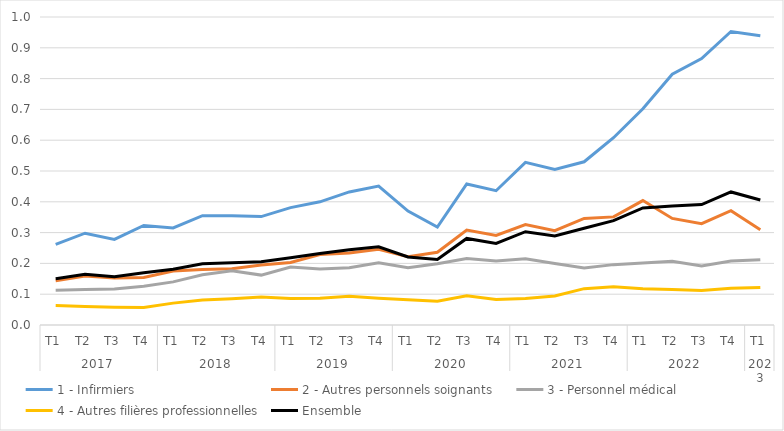
| Category | 1 - Infirmiers | 2 - Autres personnels soignants | 3 - Personnel médical | 4 - Autres filières professionnelles | Ensemble |
|---|---|---|---|---|---|
| 0 | 0.262 | 0.144 | 0.113 | 0.063 | 0.15 |
| 1 | 0.298 | 0.159 | 0.115 | 0.06 | 0.165 |
| 2 | 0.278 | 0.153 | 0.117 | 0.058 | 0.157 |
| 3 | 0.323 | 0.154 | 0.126 | 0.057 | 0.17 |
| 4 | 0.315 | 0.175 | 0.14 | 0.071 | 0.181 |
| 5 | 0.355 | 0.18 | 0.163 | 0.081 | 0.199 |
| 6 | 0.355 | 0.183 | 0.176 | 0.085 | 0.202 |
| 7 | 0.352 | 0.195 | 0.162 | 0.091 | 0.205 |
| 8 | 0.381 | 0.203 | 0.188 | 0.086 | 0.218 |
| 9 | 0.4 | 0.229 | 0.182 | 0.087 | 0.232 |
| 10 | 0.432 | 0.234 | 0.186 | 0.093 | 0.244 |
| 11 | 0.451 | 0.246 | 0.202 | 0.087 | 0.254 |
| 12 | 0.37 | 0.222 | 0.186 | 0.082 | 0.221 |
| 13 | 0.318 | 0.236 | 0.199 | 0.077 | 0.213 |
| 14 | 0.458 | 0.308 | 0.216 | 0.095 | 0.281 |
| 15 | 0.436 | 0.291 | 0.208 | 0.083 | 0.265 |
| 16 | 0.528 | 0.326 | 0.215 | 0.086 | 0.303 |
| 17 | 0.505 | 0.306 | 0.2 | 0.094 | 0.289 |
| 18 | 0.53 | 0.346 | 0.185 | 0.118 | 0.314 |
| 19 | 0.608 | 0.351 | 0.196 | 0.124 | 0.339 |
| 20 | 0.702 | 0.404 | 0.201 | 0.118 | 0.38 |
| 21 | 0.814 | 0.346 | 0.207 | 0.115 | 0.386 |
| 22 | 0.865 | 0.329 | 0.192 | 0.112 | 0.391 |
| 23 | 0.953 | 0.371 | 0.208 | 0.119 | 0.432 |
| 24 | 0.939 | 0.309 | 0.212 | 0.122 | 0.406 |